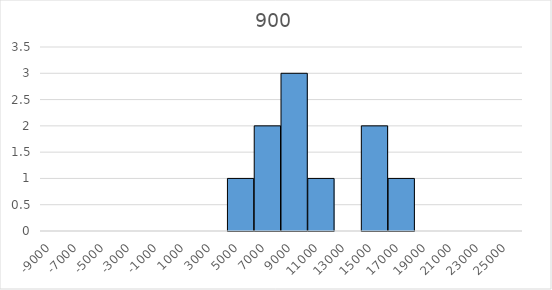
| Category | Series 0 | Series 1 |
|---|---|---|
| -9000.0 | 0 | 0 |
| -7000.0 | 0 | 0 |
| -5000.0 | 0 | 0 |
| -3000.0 | 0 | 0 |
| -1000.0 | 0 | 0 |
| 1000.0 | 0 | 0 |
| 3000.0 | 0 | 0 |
| 5000.0 | 0 | 1 |
| 7000.0 | 0 | 2 |
| 9000.0 | 0 | 3 |
| 11000.0 | 0 | 1 |
| 13000.0 | 0 | 0 |
| 15000.0 | 0 | 2 |
| 17000.0 | 0 | 1 |
| 19000.0 | 0 | 0 |
| 21000.0 | 0 | 0 |
| 23000.0 | 0 | 0 |
| 25000.0 | 0 | 0 |